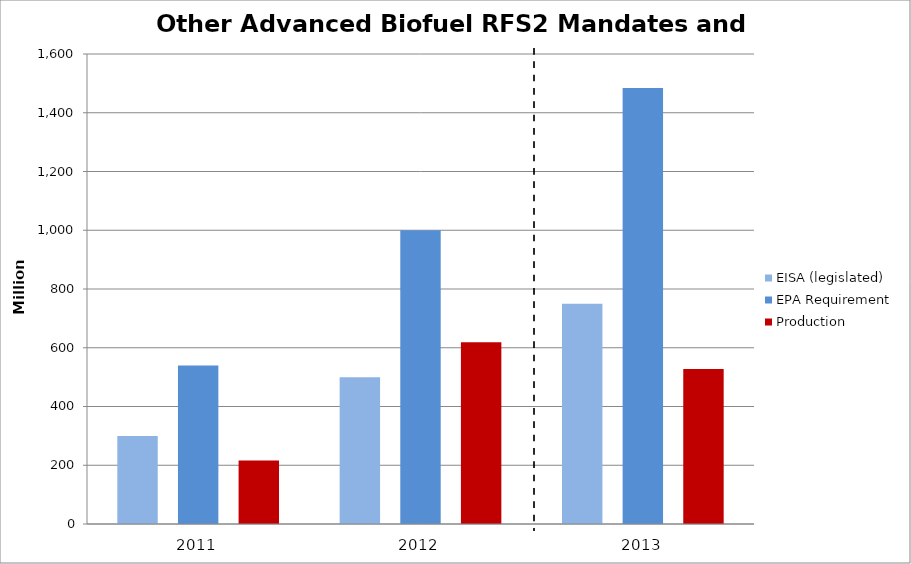
| Category | EISA (legislated) | EPA Requirement | Production |
|---|---|---|---|
| 2011.0 | 300 | 540 | 216 |
| 2012.0 | 500 | 1000 | 619 |
| 2013.0 | 750 | 1484 | 528 |